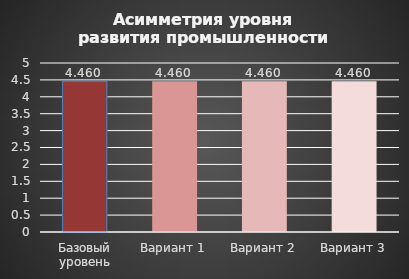
| Category | Асимметрия уровня развития промышленности |
|---|---|
| Базовый уровень | 4.46 |
| Вариант 1 | 4.46 |
| Вариант 2 | 4.46 |
| Вариант 3 | 4.46 |